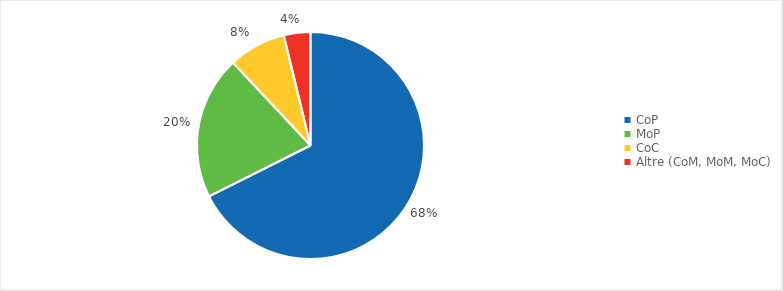
| Category | Series 0 |
|---|---|
| CoP | 0.676 |
| MoP | 0.204 |
| CoC | 0.082 |
| Altre (CoM, MoM, MoC) | 0.038 |